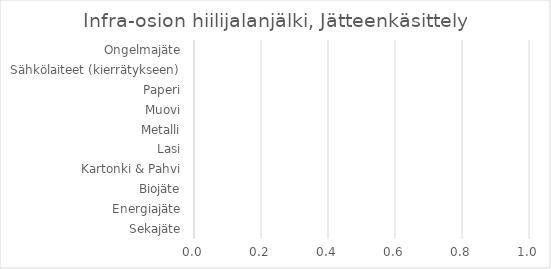
| Category | Ruoka-osion hiilijalanjälki |
|---|---|
| Liha-annos | 0 |
| Kasvisannos | 0 |
| Vegaaninen annos | 0 |
| Jälkiruoka | 0 |
| Muut | 0 |